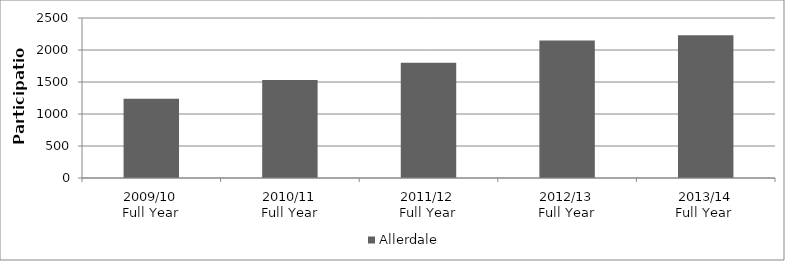
| Category | Allerdale |
|---|---|
| 2009/10
Full Year | 1240 |
| 2010/11
Full Year | 1530 |
| 2011/12
Full Year | 1800 |
| 2012/13
Full Year | 2150 |
| 2013/14
Full Year  | 2230 |